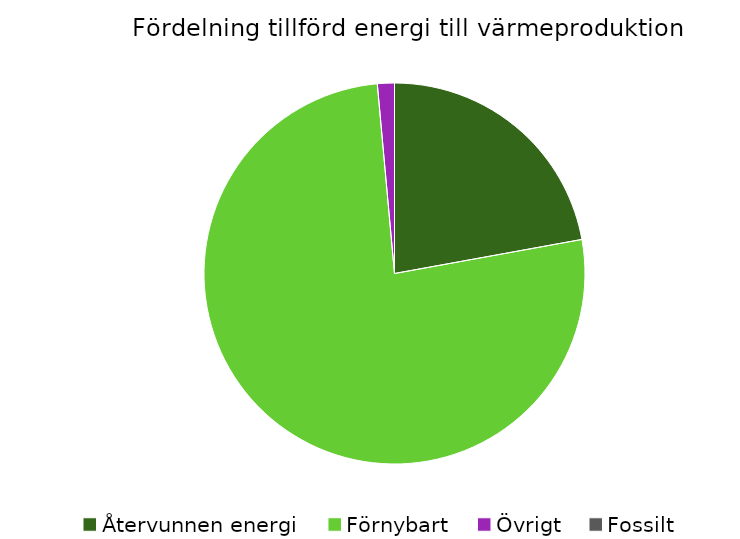
| Category | Fördelning värmeproduktion |
|---|---|
| Återvunnen energi | 0.221 |
| Förnybart | 0.764 |
| Övrigt | 0.014 |
| Fossilt | 0 |